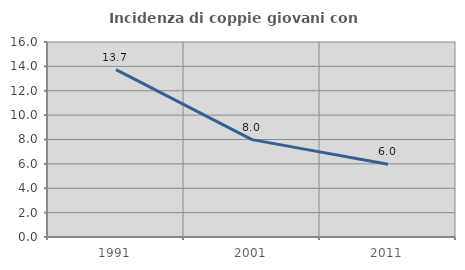
| Category | Incidenza di coppie giovani con figli |
|---|---|
| 1991.0 | 13.73 |
| 2001.0 | 7.99 |
| 2011.0 | 5.974 |